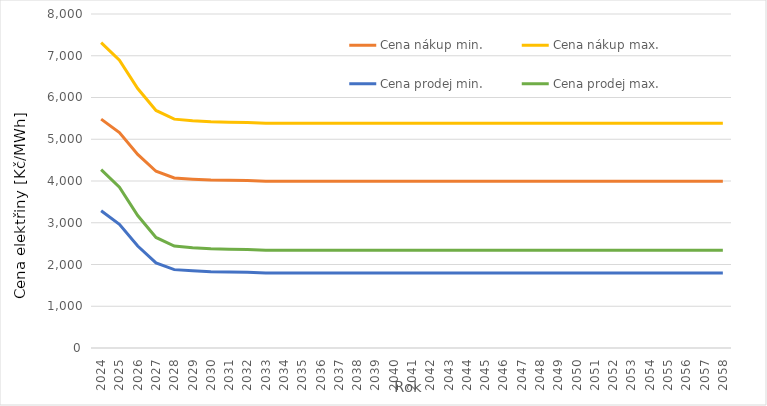
| Category | Cena nákup min. | Cena nákup max. | Cena prodej min. | Cena prodej max. |
|---|---|---|---|---|
| 2024.0 | 5482.462 | 7313.711 | 3286.162 | 4272.011 |
| 2025.0 | 5160.557 | 6895.234 | 2964.257 | 3853.534 |
| 2026.0 | 4637.516 | 6215.281 | 2441.216 | 3173.581 |
| 2027.0 | 4232.935 | 5689.326 | 2036.635 | 2647.626 |
| 2028.0 | 4073.48 | 5482.034 | 1877.18 | 2440.334 |
| 2029.0 | 4044.42 | 5444.256 | 1848.12 | 2402.556 |
| 2030.0 | 4023.757 | 5417.394 | 1827.457 | 2375.694 |
| 2031.0 | 4016.916 | 5408.501 | 1820.616 | 2366.801 |
| 2032.0 | 4009.227 | 5398.504 | 1812.927 | 2356.804 |
| 2033.0 | 3995.333 | 5380.443 | 1799.033 | 2338.743 |
| 2034.0 | 3995.333 | 5380.443 | 1799.033 | 2338.743 |
| 2035.0 | 3995.333 | 5380.443 | 1799.033 | 2338.743 |
| 2036.0 | 3995.333 | 5380.443 | 1799.033 | 2338.743 |
| 2037.0 | 3995.333 | 5380.443 | 1799.033 | 2338.743 |
| 2038.0 | 3995.333 | 5380.443 | 1799.033 | 2338.743 |
| 2039.0 | 3995.333 | 5380.443 | 1799.033 | 2338.743 |
| 2040.0 | 3995.333 | 5380.443 | 1799.033 | 2338.743 |
| 2041.0 | 3995.333 | 5380.443 | 1799.033 | 2338.743 |
| 2042.0 | 3995.333 | 5380.443 | 1799.033 | 2338.743 |
| 2043.0 | 3995.333 | 5380.443 | 1799.033 | 2338.743 |
| 2044.0 | 3995.333 | 5380.443 | 1799.033 | 2338.743 |
| 2045.0 | 3995.333 | 5380.443 | 1799.033 | 2338.743 |
| 2046.0 | 3995.333 | 5380.443 | 1799.033 | 2338.743 |
| 2047.0 | 3995.333 | 5380.443 | 1799.033 | 2338.743 |
| 2048.0 | 3995.333 | 5380.443 | 1799.033 | 2338.743 |
| 2049.0 | 3995.333 | 5380.443 | 1799.033 | 2338.743 |
| 2050.0 | 3995.333 | 5380.443 | 1799.033 | 2338.743 |
| 2051.0 | 3995.333 | 5380.443 | 1799.033 | 2338.743 |
| 2052.0 | 3995.333 | 5380.443 | 1799.033 | 2338.743 |
| 2053.0 | 3995.333 | 5380.443 | 1799.033 | 2338.743 |
| 2054.0 | 3995.333 | 5380.443 | 1799.033 | 2338.743 |
| 2055.0 | 3995.333 | 5380.443 | 1799.033 | 2338.743 |
| 2056.0 | 3995.333 | 5380.443 | 1799.033 | 2338.743 |
| 2057.0 | 3995.333 | 5380.443 | 1799.033 | 2338.743 |
| 2058.0 | 3995.333 | 5380.443 | 1799.033 | 2338.743 |